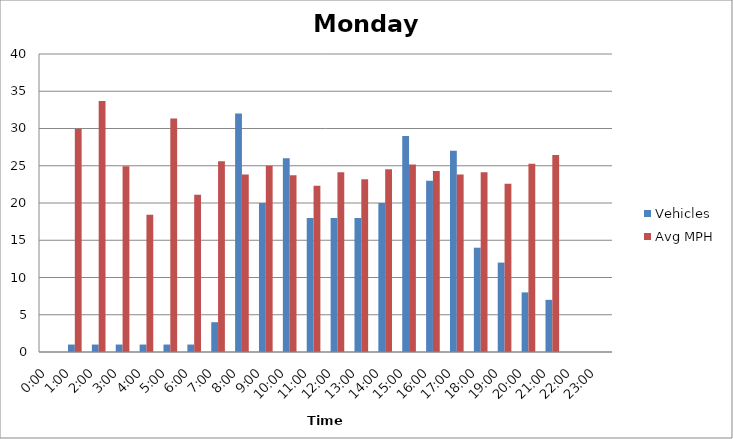
| Category | Vehicles | Avg MPH |
|---|---|---|
| 0:00 | 0 | 0 |
| 1:00 | 1 | 29.98 |
| 2:00 | 1 | 33.69 |
| 3:00 | 1 | 24.93 |
| 4:00 | 1 | 18.43 |
| 5:00 | 1 | 31.34 |
| 6:00 | 1 | 21.12 |
| 7:00 | 4 | 25.6 |
| 8:00 | 32 | 23.82 |
| 9:00 | 20 | 25 |
| 10:00 | 26 | 23.74 |
| 11:00 | 18 | 22.3 |
| 12:00 | 18 | 24.13 |
| 13:00 | 18 | 23.19 |
| 14:00 | 20 | 24.53 |
| 15:00 | 29 | 25.17 |
| 16:00 | 23 | 24.28 |
| 17:00 | 27 | 23.81 |
| 18:00 | 14 | 24.13 |
| 19:00 | 12 | 22.6 |
| 20:00 | 8 | 25.28 |
| 21:00 | 7 | 26.45 |
| 22:00 | 0 | 0 |
| 23:00 | 0 | 0 |